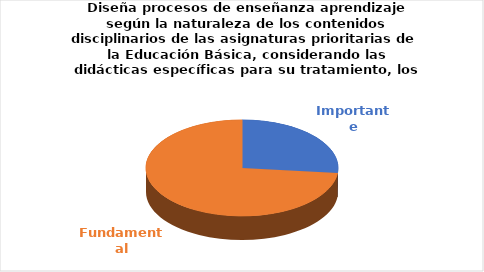
| Category | Series 0 |
|---|---|
| Importante | 4 |
| Fundamental | 11 |